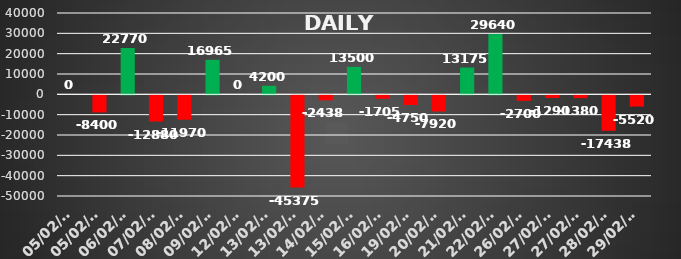
| Category | Series 0 |
|---|---|
| 2024-02-05 | 0 |
| 2024-02-05 | -8400 |
| 2024-02-06 | 22770 |
| 2024-02-07 | -12880 |
| 2024-02-08 | -11970 |
| 2024-02-09 | 16965 |
| 2024-02-12 | 0 |
| 2024-02-13 | 4200 |
| 2024-02-13 | -45375 |
| 2024-02-14 | -2437.5 |
| 2024-02-15 | 13500 |
| 2024-02-16 | -1705 |
| 2024-02-19 | -4750 |
| 2024-02-20 | -7920 |
| 2024-02-21 | 13175 |
| 2024-02-22 | 29640 |
| 2024-02-26 | -2700 |
| 2024-02-27 | -1290 |
| 2024-02-27 | -1380 |
| 2024-02-28 | -17437.5 |
| 2024-02-29 | -5520 |